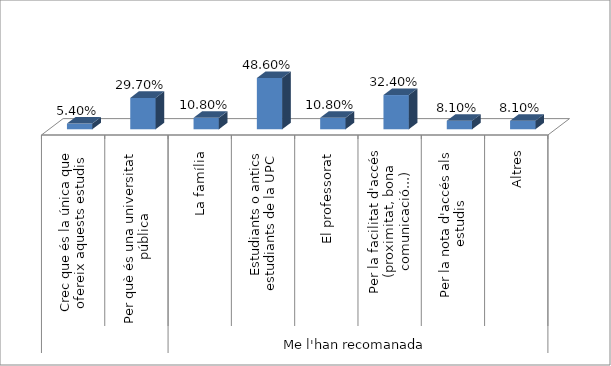
| Category | Grau en Estudis d'Arquitectura |
|---|---|
| 0 | 0.054 |
| 1 | 0.297 |
| 2 | 0.108 |
| 3 | 0.486 |
| 4 | 0.108 |
| 5 | 0.324 |
| 6 | 0.081 |
| 7 | 0.081 |